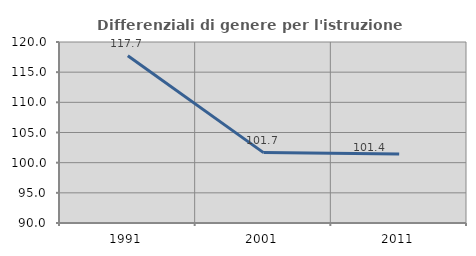
| Category | Differenziali di genere per l'istruzione superiore |
|---|---|
| 1991.0 | 117.724 |
| 2001.0 | 101.665 |
| 2011.0 | 101.435 |